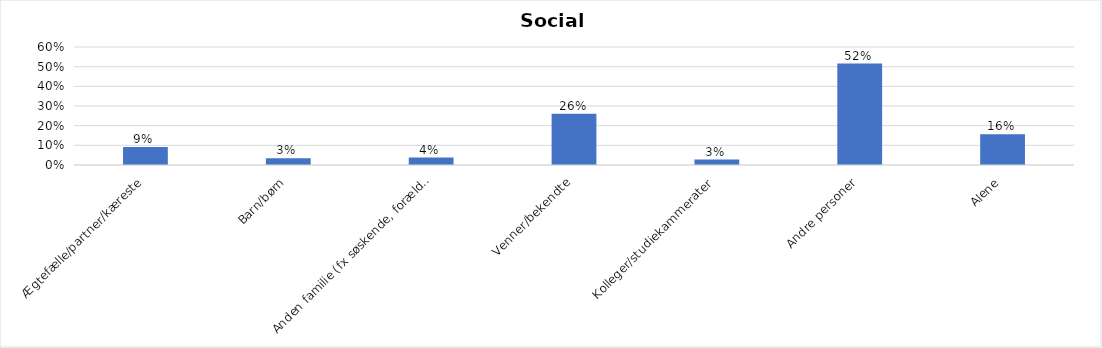
| Category | % |
|---|---|
| Ægtefælle/partner/kæreste | 0.092 |
| Barn/børn | 0.034 |
| Anden familie (fx søskende, forældre) | 0.038 |
| Venner/bekendte | 0.26 |
| Kolleger/studiekammerater | 0.028 |
| Andre personer | 0.516 |
| Alene | 0.156 |